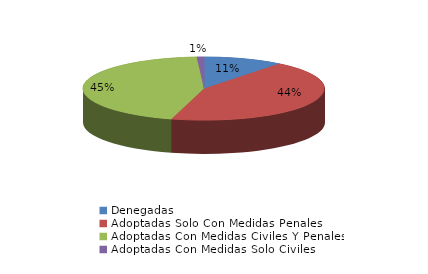
| Category | Series 0 |
|---|---|
| Denegadas | 33 |
| Adoptadas Solo Con Medidas Penales | 136 |
| Adoptadas Con Medidas Civiles Y Penales | 139 |
| Adoptadas Con Medidas Solo Civiles | 3 |